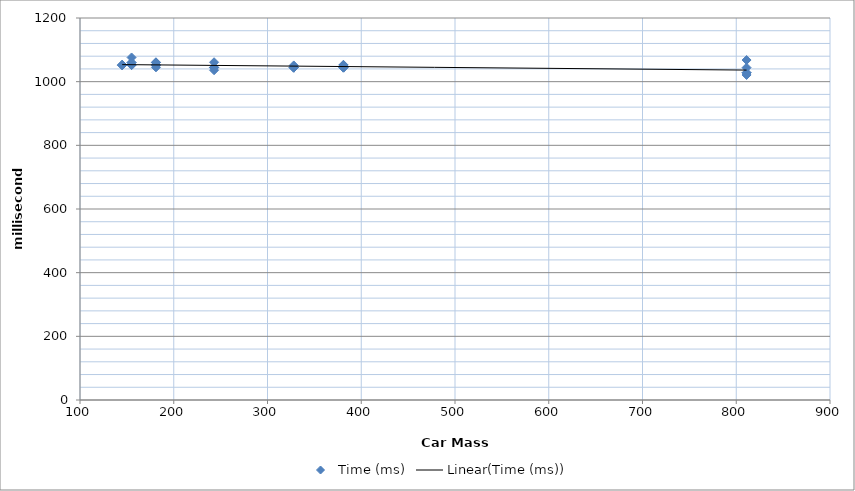
| Category | Time (ms) |
|---|---|
| 145.0 | 1052 |
| 145.0 | 1052 |
| 145.0 | 1052 |
| 145.0 | 1052 |
| 145.0 | 1053 |
| 155.0 | 1052 |
| 155.0 | 1060 |
| 155.0 | 1052 |
| 155.0 | 1076 |
| 155.0 | 1060 |
| 181.0 | 1061 |
| 181.0 | 1051 |
| 181.0 | 1060 |
| 181.0 | 1053 |
| 181.0 | 1045 |
| 243.0 | 1045 |
| 243.0 | 1045 |
| 243.0 | 1044 |
| 243.0 | 1061 |
| 243.0 | 1036 |
| 328.0 | 1051 |
| 328.0 | 1045 |
| 328.0 | 1044 |
| 328.0 | 1044 |
| 328.0 | 1044 |
| 381.0 | 1052 |
| 381.0 | 1053 |
| 381.0 | 1044 |
| 381.0 | 1044 |
| 381.0 | 1045 |
| 811.0 | 1044 |
| 811.0 | 1068 |
| 811.0 | 1021 |
| 811.0 | 1028 |
| 811.0 | 1028 |